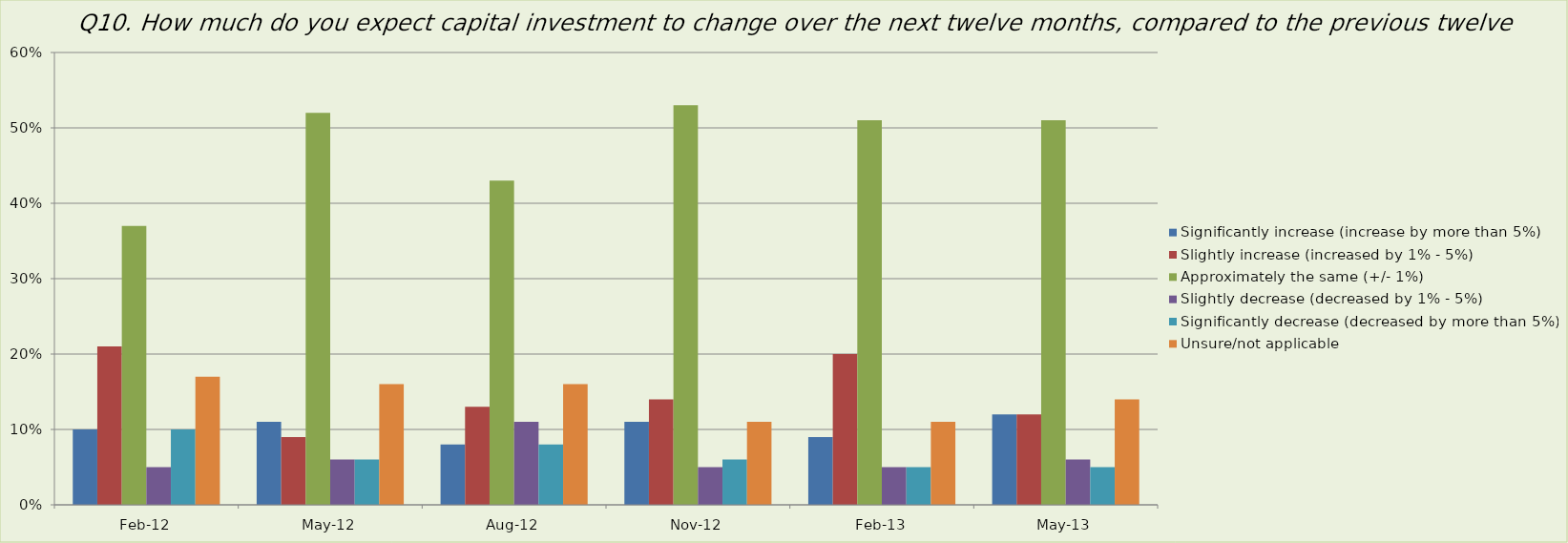
| Category | Significantly increase (increase by more than 5%) | Slightly increase (increased by 1% - 5%) | Approximately the same (+/- 1%) | Slightly decrease (decreased by 1% - 5%) | Significantly decrease (decreased by more than 5%) | Unsure/not applicable |
|---|---|---|---|---|---|---|
| 2012-02-01 | 0.1 | 0.21 | 0.37 | 0.05 | 0.1 | 0.17 |
| 2012-05-01 | 0.11 | 0.09 | 0.52 | 0.06 | 0.06 | 0.16 |
| 2012-08-01 | 0.08 | 0.13 | 0.43 | 0.11 | 0.08 | 0.16 |
| 2012-11-01 | 0.11 | 0.14 | 0.53 | 0.05 | 0.06 | 0.11 |
| 2013-02-01 | 0.09 | 0.2 | 0.51 | 0.05 | 0.05 | 0.11 |
| 2013-05-01 | 0.12 | 0.12 | 0.51 | 0.06 | 0.05 | 0.14 |